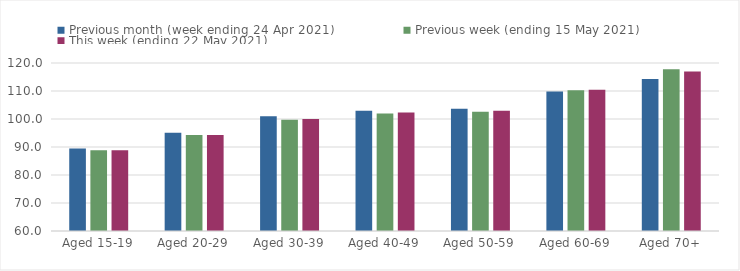
| Category | Previous month (week ending 24 Apr 2021) | Previous week (ending 15 May 2021) | This week (ending 22 May 2021) |
|---|---|---|---|
| Aged 15-19 | 89.48 | 88.86 | 88.81 |
| Aged 20-29 | 95.05 | 94.26 | 94.32 |
| Aged 30-39 | 100.99 | 99.77 | 100 |
| Aged 40-49 | 102.99 | 101.97 | 102.33 |
| Aged 50-59 | 103.69 | 102.6 | 102.91 |
| Aged 60-69 | 109.81 | 110.28 | 110.49 |
| Aged 70+ | 114.28 | 117.78 | 116.93 |